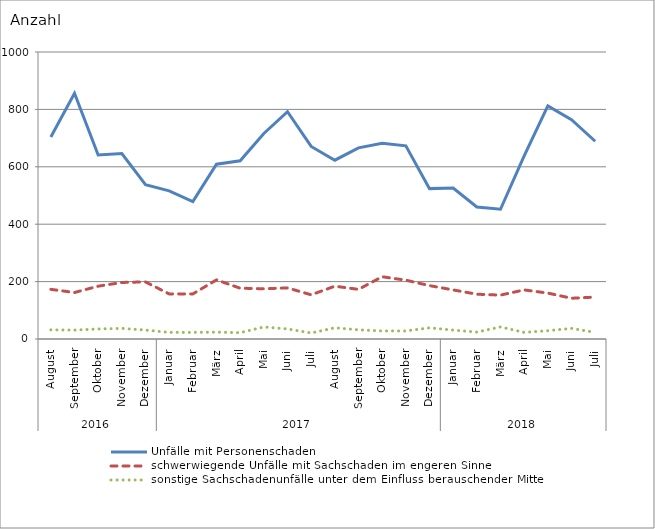
| Category | Unfälle mit Personenschaden | schwerwiegende Unfälle mit Sachschaden im engeren Sinne | sonstige Sachschadenunfälle unter dem Einfluss berauschender Mittel |
|---|---|---|---|
| 0 | 704 | 173 | 32 |
| 1 | 856 | 162 | 31 |
| 2 | 641 | 184 | 35 |
| 3 | 646 | 197 | 37 |
| 4 | 538 | 199 | 31 |
| 5 | 516 | 157 | 23 |
| 6 | 479 | 157 | 23 |
| 7 | 609 | 206 | 24 |
| 8 | 621 | 177 | 22 |
| 9 | 716 | 175 | 42 |
| 10 | 792 | 178 | 35 |
| 11 | 671 | 154 | 21 |
| 12 | 623 | 184 | 39 |
| 13 | 666 | 173 | 32 |
| 14 | 682 | 217 | 28 |
| 15 | 673 | 205 | 28 |
| 16 | 524 | 186 | 39 |
| 17 | 526 | 171 | 31 |
| 18 | 460 | 156 | 24 |
| 19 | 452 | 153 | 42 |
| 20 | 638 | 171 | 23 |
| 21 | 812 | 160 | 29 |
| 22 | 764 | 142 | 37 |
| 23 | 689 | 146 | 23 |